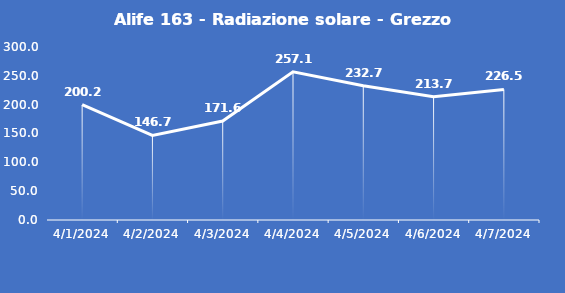
| Category | Alife 163 - Radiazione solare - Grezzo (W/m2) |
|---|---|
| 4/1/24 | 200.2 |
| 4/2/24 | 146.7 |
| 4/3/24 | 171.6 |
| 4/4/24 | 257.1 |
| 4/5/24 | 232.7 |
| 4/6/24 | 213.7 |
| 4/7/24 | 226.5 |